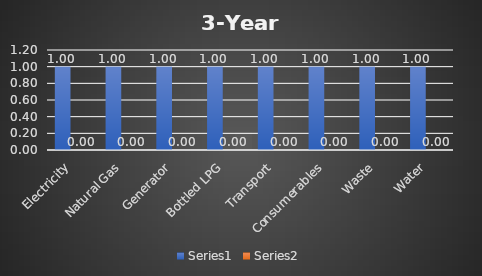
| Category | Series 0 | Series 1 |
|---|---|---|
| Electricity | 1 | 0 |
| Natural Gas | 1 | 0 |
| Generator | 1 | 0 |
| Bottled LPG | 1 | 0 |
| Transport | 1 | 0 |
| Consumerables | 1 | 0 |
| Waste | 1 | 0 |
| Water | 1 | 0 |